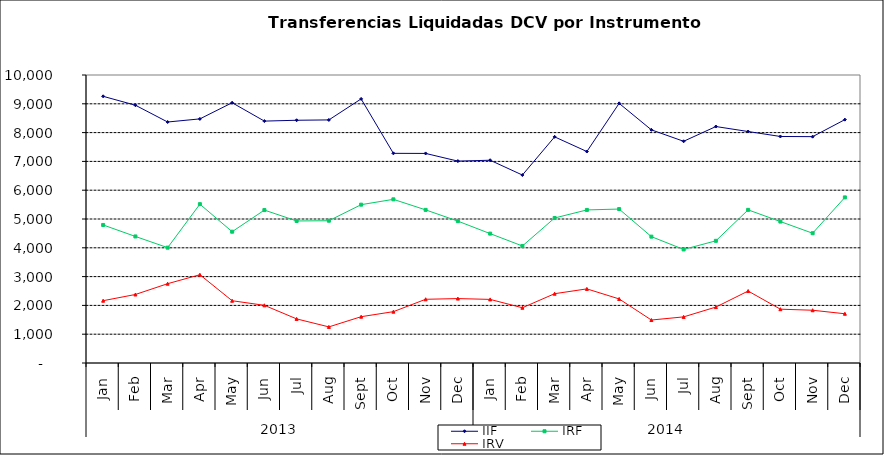
| Category | IIF | IRF | IRV |
|---|---|---|---|
| 0 | 9259.796 | 4792.777 | 2163.489 |
| 1900-01-01 | 8950.912 | 4394.117 | 2378.549 |
| 1900-01-02 | 8367.889 | 4004.957 | 2753.585 |
| 1900-01-03 | 8475.718 | 5515.336 | 3065.046 |
| 1900-01-04 | 9036.55 | 4559.304 | 2162.168 |
| 1900-01-05 | 8399.41 | 5309.543 | 2003.027 |
| 1900-01-06 | 8428.503 | 4931.801 | 1531.294 |
| 1900-01-07 | 8440.671 | 4940.307 | 1253.682 |
| 1900-01-08 | 9169.609 | 5498.033 | 1607.568 |
| 1900-01-09 | 7280.063 | 5682.603 | 1782.451 |
| 1900-01-10 | 7276.501 | 5316.726 | 2212.207 |
| 1900-01-11 | 7009.987 | 4925.996 | 2236.787 |
| 1900-01-12 | 7040.513 | 4492.461 | 2208.212 |
| 1900-01-13 | 6526.167 | 4063.402 | 1918.146 |
| 1900-01-14 | 7851.685 | 5035.004 | 2406.418 |
| 1900-01-15 | 7343.151 | 5314.685 | 2573.305 |
| 1900-01-16 | 9015.077 | 5345.213 | 2224.58 |
| 1900-01-17 | 8095.624 | 4387.369 | 1492.142 |
| 1900-01-18 | 7698.102 | 3943.016 | 1601.456 |
| 1900-01-19 | 8210.519 | 4242.575 | 1942.224 |
| 1900-01-20 | 8037.241 | 5317.175 | 2498.419 |
| 1900-01-21 | 7865.389 | 4911.342 | 1868.913 |
| 1900-01-22 | 7859.502 | 4505.806 | 1831.846 |
| 1900-01-23 | 8450.292 | 5750.193 | 1709.948 |